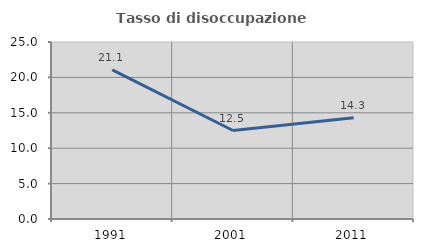
| Category | Tasso di disoccupazione giovanile  |
|---|---|
| 1991.0 | 21.053 |
| 2001.0 | 12.5 |
| 2011.0 | 14.286 |